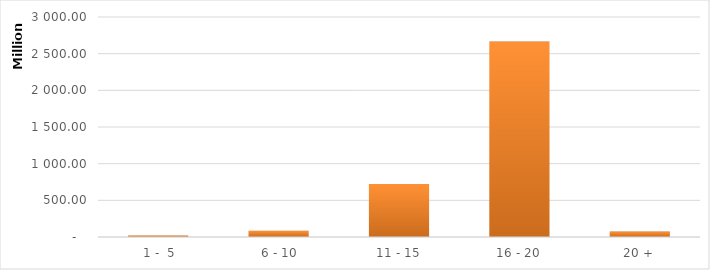
| Category | Series 0 |
|---|---|
|  1 -  5 | 20082764.136 |
|  6 - 10 | 84166521.15 |
| 11 - 15 | 724407122.948 |
| 16 - 20 | 2664827559.99 |
| 20 + | 74670426.367 |